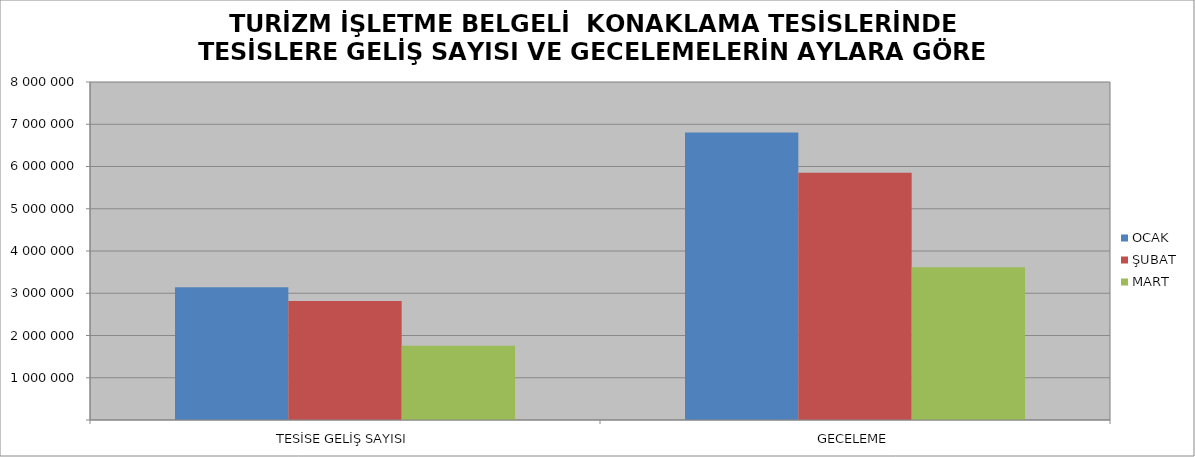
| Category | OCAK | ŞUBAT | MART |
|---|---|---|---|
| TESİSE GELİŞ SAYISI | 3140857 | 2816145 | 1756166 |
| GECELEME | 6806196 | 5853519 | 3616071 |